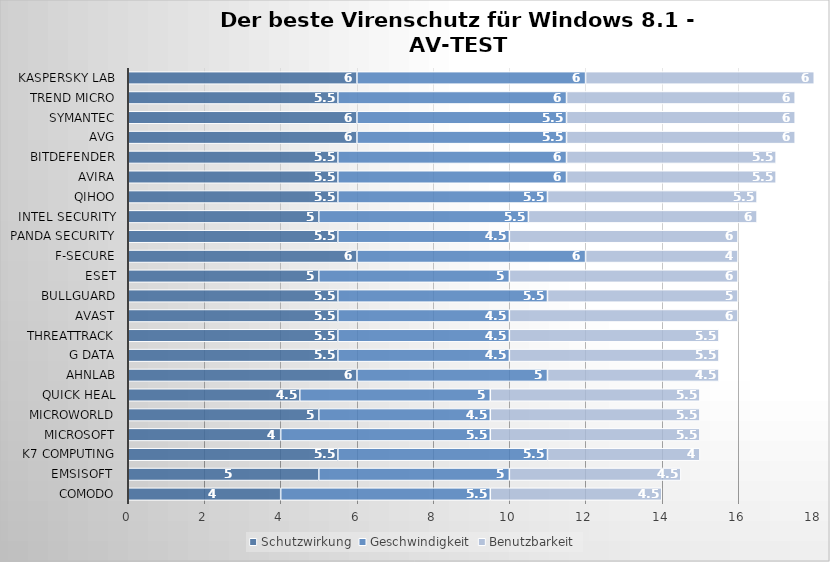
| Category | Schutzwirkung | Geschwindigkeit | Benutzbarkeit |
|---|---|---|---|
| Comodo | 4 | 5.5 | 4.5 |
| Emsisoft  | 5 | 5 | 4.5 |
| K7 Computing | 5.5 | 5.5 | 4 |
| Microsoft | 4 | 5.5 | 5.5 |
| Microworld | 5 | 4.5 | 5.5 |
| Quick Heal | 4.5 | 5 | 5.5 |
| AhnLab | 6 | 5 | 4.5 |
| G Data | 5.5 | 4.5 | 5.5 |
| ThreatTrack | 5.5 | 4.5 | 5.5 |
| Avast | 5.5 | 4.5 | 6 |
| BullGuard | 5.5 | 5.5 | 5 |
| ESET | 5 | 5 | 6 |
| F-Secure | 6 | 6 | 4 |
| Panda Security | 5.5 | 4.5 | 6 |
| Intel Security | 5 | 5.5 | 6 |
| Qihoo | 5.5 | 5.5 | 5.5 |
| Avira | 5.5 | 6 | 5.5 |
| Bitdefender | 5.5 | 6 | 5.5 |
| AVG | 6 | 5.5 | 6 |
| Symantec | 6 | 5.5 | 6 |
| Trend Micro | 5.5 | 6 | 6 |
| Kaspersky Lab | 6 | 6 | 6 |